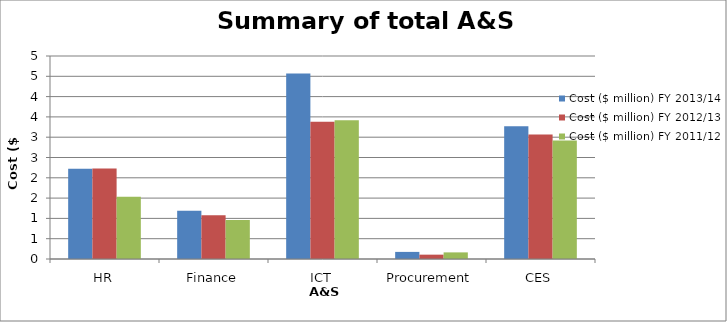
| Category | Cost ($ million) FY 2013/14 | Cost ($ million) FY 2012/13 | Cost ($ million) FY 2011/12 |
|---|---|---|---|
| HR | 2.22 | 2.226 | 1.534 |
| Finance | 1.186 | 1.079 | 0.959 |
| ICT | 4.571 | 3.379 | 3.418 |
| Procurement | 0.175 | 0.107 | 0.163 |
| CES | 3.267 | 3.064 | 2.917 |